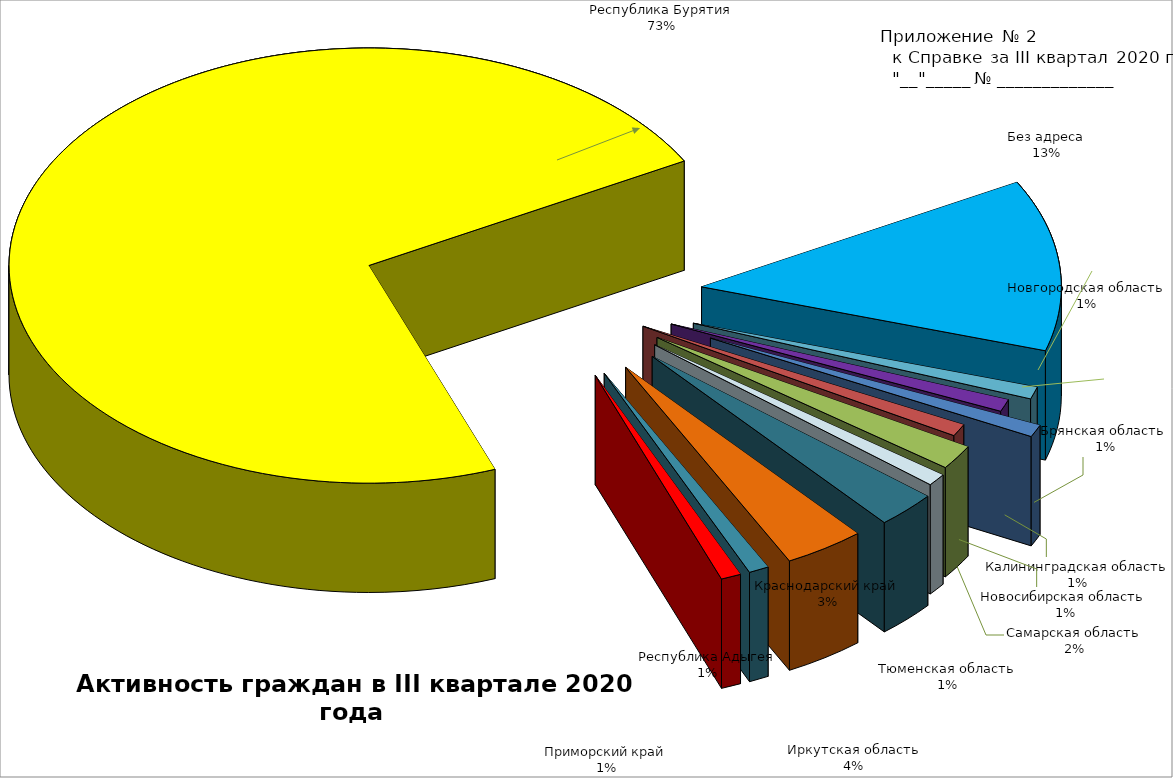
| Category | Series 1 |
|---|---|
| Краснодарский край | 3 |
| Иркутская область | 4 |
| Республика Адыгея | 1 |
| Приморский край | 1 |
| Республика Бурятия | 80 |
| Без адреса | 14 |
| Брянская область  | 1 |
| Калининградская область | 1 |
| Новгородская область | 1 |
| Новосибирская область  | 1 |
| Самарская область | 2 |
| Тюменская область | 1 |